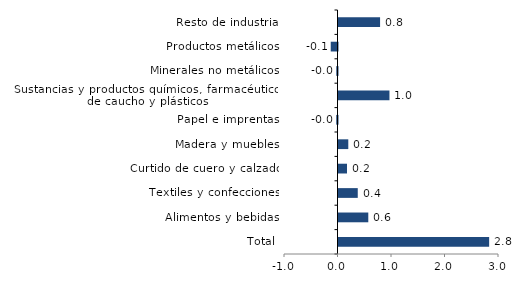
| Category | Series 0 |
|---|---|
| Total | 2.816 |
| Alimentos y bebidas | 0.557 |
| Textiles y confecciones | 0.36 |
| Curtido de cuero y calzado | 0.159 |
| Madera y muebles | 0.183 |
| Papel e imprentas | -0.023 |
| Sustancias y productos químicos, farmacéuticos, de caucho y plásticos | 0.952 |
| Minerales no metálicos | -0.023 |
| Productos metálicos | -0.127 |
| Resto de industria | 0.777 |